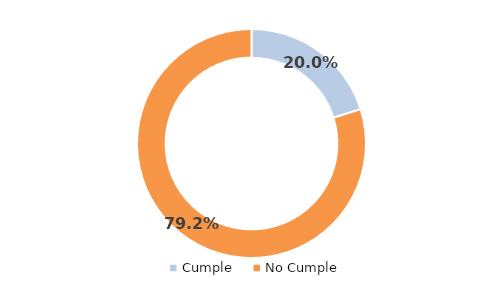
| Category | Series 0 |
|---|---|
| Cumple | 0.2 |
| No Cumple | 0.792 |